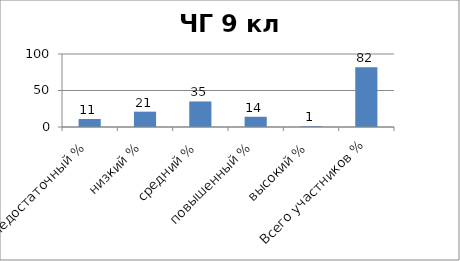
| Category | Series 0 |
|---|---|
| недостаточный % | 11 |
| низкий % | 21 |
| средний % | 35 |
| повышенный % | 14 |
| высокий % | 1 |
| Всего участников % | 82 |